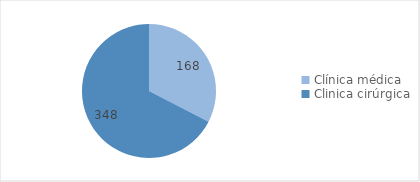
| Category | Series 0 |
|---|---|
| Clínica médica | 168 |
| Clinica cirúrgica | 348 |